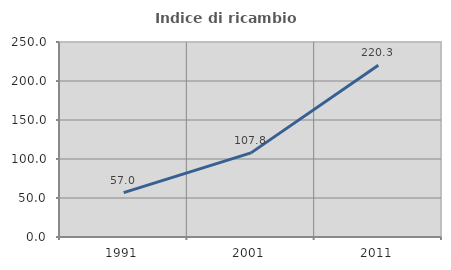
| Category | Indice di ricambio occupazionale  |
|---|---|
| 1991.0 | 56.955 |
| 2001.0 | 107.843 |
| 2011.0 | 220.302 |